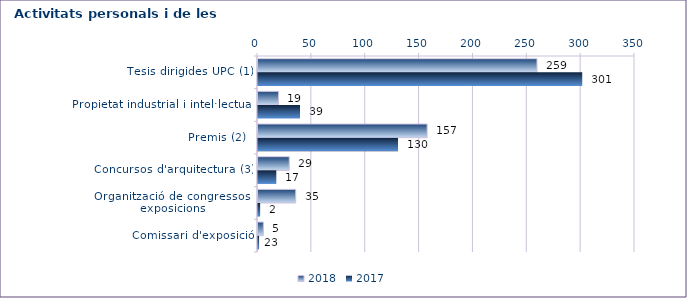
| Category | 2018 | 2017 |
|---|---|---|
| Tesis dirigides UPC (1) | 259 | 301 |
| Propietat industrial i intel·lectual | 19 | 39 |
| Premis (2)  | 157 | 130 |
| Concursos d'arquitectura (3) | 29 | 17 |
| Organització de congressos i exposicions | 35 | 2 |
| Comissari d'exposició | 5 | 1 |